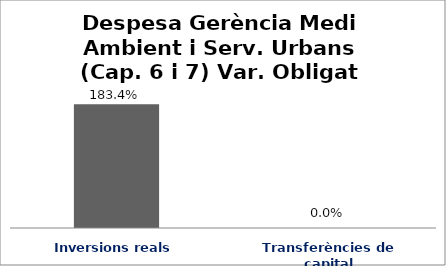
| Category | Series 0 |
|---|---|
| Inversions reals | 1.834 |
| Transferències de capital | 0 |